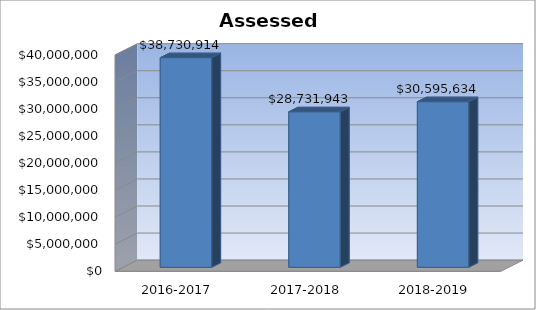
| Category | Assessed Valuation |
|---|---|
| 2016-2017 | 38730914 |
| 2017-2018 | 28731943 |
| 2018-2019 | 30595634 |